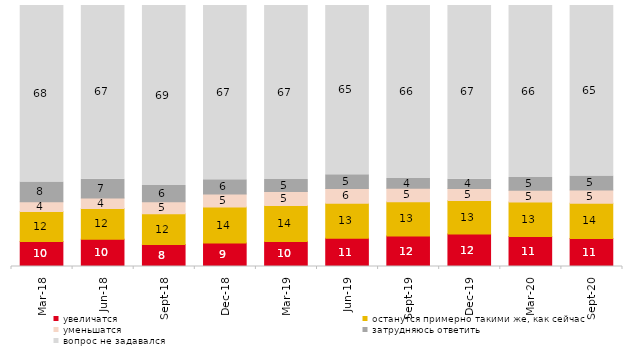
| Category | увеличатся | останутся примерно такими же, как сейчас | уменьшатся | затрудняюсь ответить | вопрос не задавался |
|---|---|---|---|---|---|
| 2018-03-01 | 9.6 | 11.5 | 3.75 | 7.5 | 67.65 |
| 2018-06-01 | 10.45 | 11.75 | 4.05 | 7.2 | 66.55 |
| 2018-09-01 | 8.45 | 11.8 | 4.6 | 6.15 | 69 |
| 2018-12-01 | 9.05 | 13.7 | 5 | 5.5 | 66.75 |
| 2019-03-01 | 9.597 | 13.774 | 5.321 | 4.625 | 66.683 |
| 2019-06-01 | 10.823 | 13.367 | 5.736 | 5.237 | 64.838 |
| 2019-09-01 | 11.683 | 13.119 | 5.198 | 3.713 | 66.287 |
| 2019-12-01 | 12.426 | 12.871 | 4.554 | 3.564 | 66.584 |
| 2020-03-01 | 11.453 | 13.287 | 4.512 | 4.809 | 65.94 |
| 2020-09-01 | 10.702 | 13.539 | 5.077 | 5.376 | 65.306 |